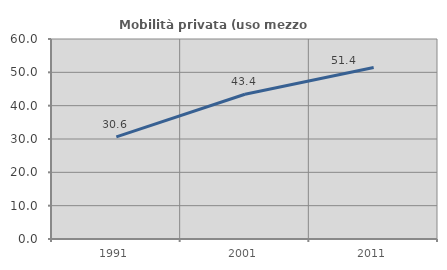
| Category | Mobilità privata (uso mezzo privato) |
|---|---|
| 1991.0 | 30.636 |
| 2001.0 | 43.438 |
| 2011.0 | 51.449 |